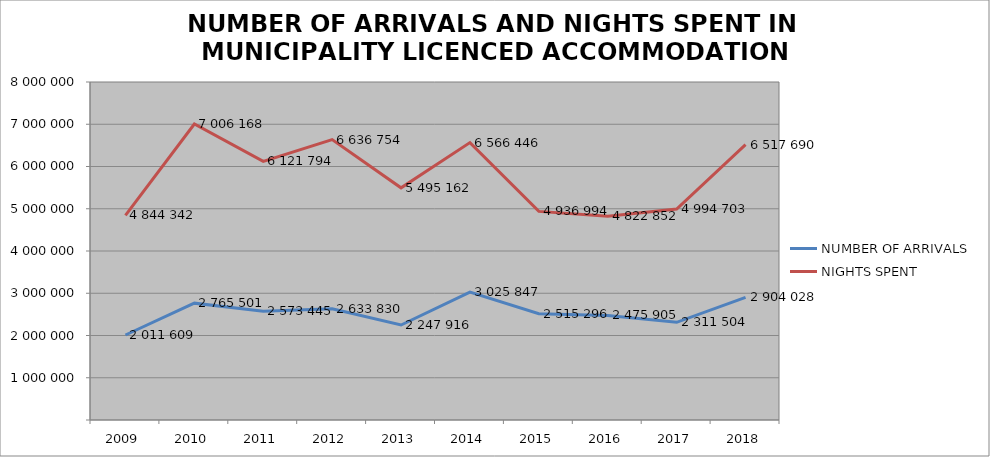
| Category | NUMBER OF ARRIVALS | NIGHTS SPENT |
|---|---|---|
| 2009 | 2011609 | 4844342 |
| 2010 | 2765501 | 7006168 |
| 2011 | 2573445 | 6121794 |
| 2012 | 2633830 | 6636754 |
| 2013 | 2247916 | 5495162 |
| 2014 | 3025847 | 6566446 |
| 2015 | 2515296 | 4936994 |
| 2016 | 2475905 | 4822852 |
| 2017 | 2311504 | 4994703 |
| 2018 | 2904028 | 6517690 |